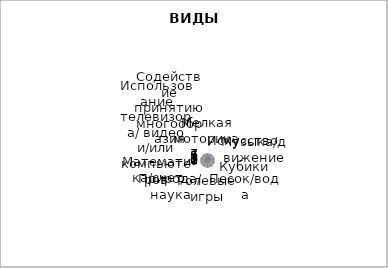
| Category | Series 0 | Series 1 | Series 2 | Series 3 |
|---|---|---|---|---|
| Мелкая моторика | 3 | 4 | 3 | 7 |
| Искусство | 3 | 3 | 3 | 3 |
| Музыка/движение | 4 | 4 | 3 | 5 |
| Кубики | 1 | 1 | 1 | 1 |
| Песок/вода | 2 | 2 | 3 | 2 |
| Ролевые игры | 2 | 2 | 2 | 2 |
| Природа/ наука | 2 | 2 | 2 | 3 |
| Математика/счет | 3 | 3 | 3 | 3 |
| Использование телевизора/ видео и/или компьютеров | 3 | 3 | 3 | 3 |
| Содействие принятию многообразия | 3 | 3 | 3 | 3 |